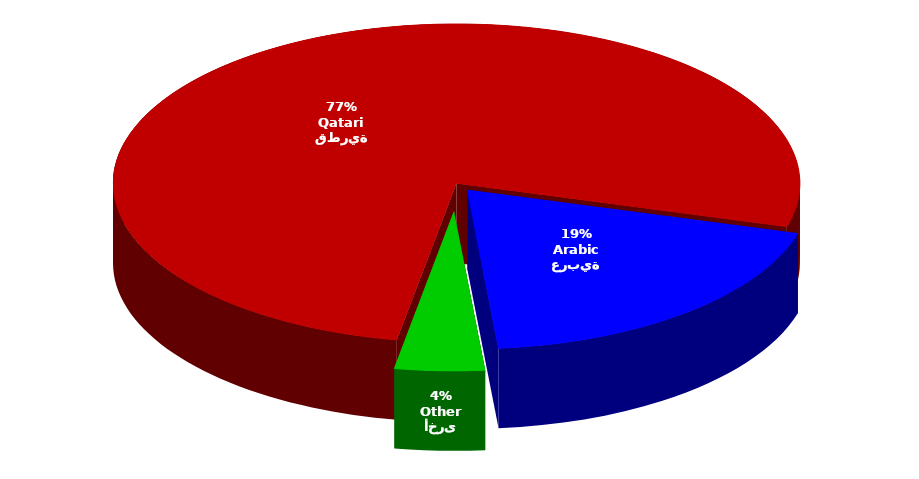
| Category | Series 0 |
|---|---|
| قطرية
Qatari | 1240271 |
| عربية
Arabic | 309994 |
| أخرى
Other | 68359 |